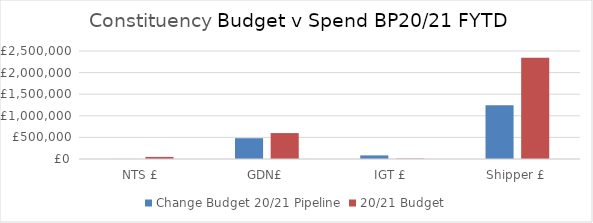
| Category | Change Budget 20/21 Pipeline | 20/21 Budget |
|---|---|---|
| NTS £ | 1200 | 48000 |
| GDN£ | 481470.524 | 600000 |
| IGT £ | 83480.252 | 9000 |
| Shipper £ | 1244639.267 | 2343000 |